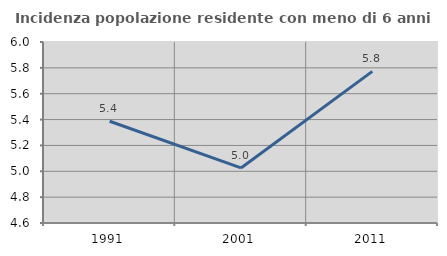
| Category | Incidenza popolazione residente con meno di 6 anni |
|---|---|
| 1991.0 | 5.387 |
| 2001.0 | 5.026 |
| 2011.0 | 5.773 |